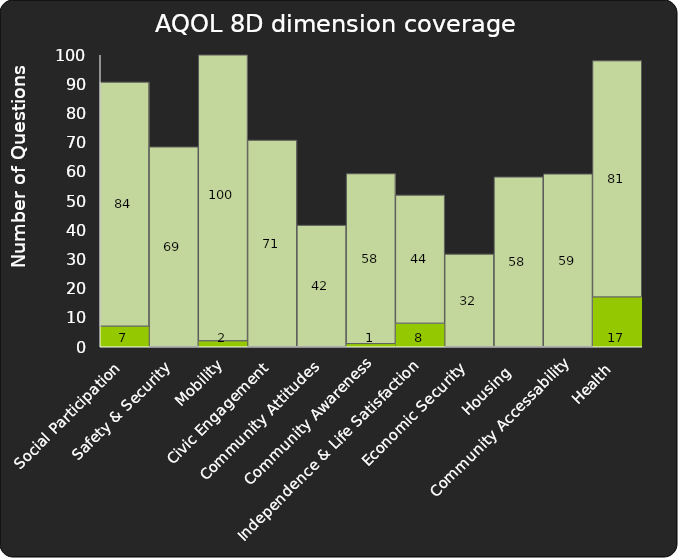
| Category | Series 0 | Series 1 |
|---|---|---|
|  Social Participation | 7 | 83.7 |
| Safety & Security | 0 | 68.5 |
| Mobility | 2 | 100 |
| Civic Engagement | 0 | 70.8 |
| Community Attitudes | 0 | 41.667 |
| Community Awareness | 1 | 58.333 |
| Independence & Life Satisfaction | 8 | 44 |
| Economic Security | 0 | 31.8 |
| Housing  | 0 | 58.209 |
| Community Accessability | 0 | 59.236 |
| Health | 17 | 81 |